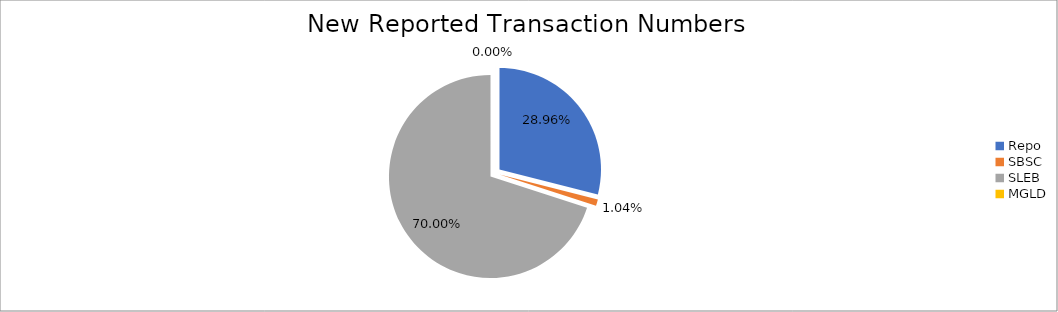
| Category | Series 0 |
|---|---|
| Repo | 269360 |
| SBSC | 9687 |
| SLEB | 651059 |
| MGLD | 4 |